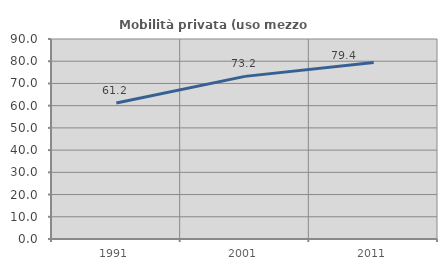
| Category | Mobilità privata (uso mezzo privato) |
|---|---|
| 1991.0 | 61.23 |
| 2001.0 | 73.179 |
| 2011.0 | 79.425 |